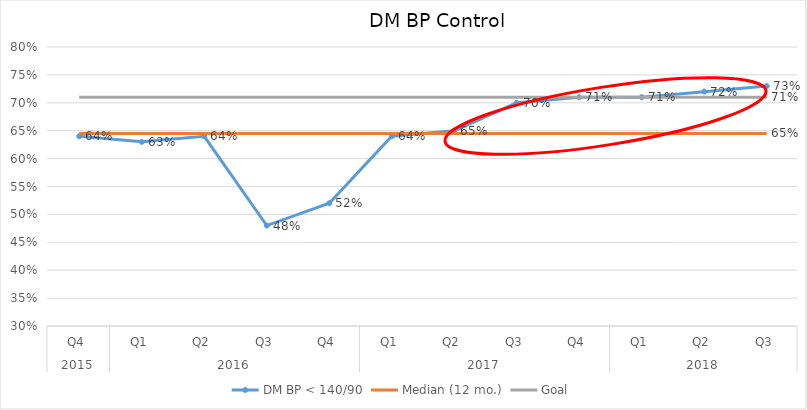
| Category | DM BP < 140/90 | Median (12 mo.) | Goal |
|---|---|---|---|
| 0 | 0.64 | 0.645 | 0.71 |
| 1 | 0.63 | 0.645 | 0.71 |
| 2 | 0.64 | 0.645 | 0.71 |
| 3 | 0.48 | 0.645 | 0.71 |
| 4 | 0.52 | 0.645 | 0.71 |
| 5 | 0.64 | 0.645 | 0.71 |
| 6 | 0.65 | 0.645 | 0.71 |
| 7 | 0.7 | 0.645 | 0.71 |
| 8 | 0.71 | 0.645 | 0.71 |
| 9 | 0.71 | 0.645 | 0.71 |
| 10 | 0.72 | 0.645 | 0.71 |
| 11 | 0.73 | 0.645 | 0.71 |